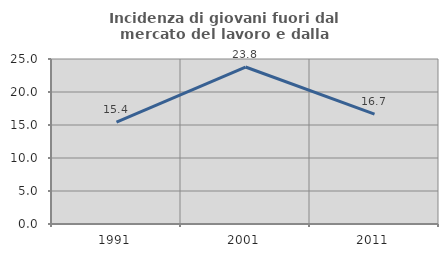
| Category | Incidenza di giovani fuori dal mercato del lavoro e dalla formazione  |
|---|---|
| 1991.0 | 15.422 |
| 2001.0 | 23.784 |
| 2011.0 | 16.654 |